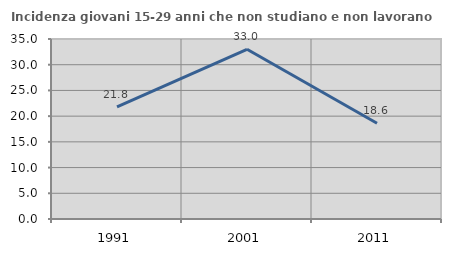
| Category | Incidenza giovani 15-29 anni che non studiano e non lavorano  |
|---|---|
| 1991.0 | 21.806 |
| 2001.0 | 33.005 |
| 2011.0 | 18.611 |